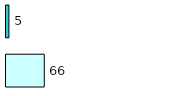
| Category | Series 0 | Series 1 |
|---|---|---|
| 0 | 66 | 5 |